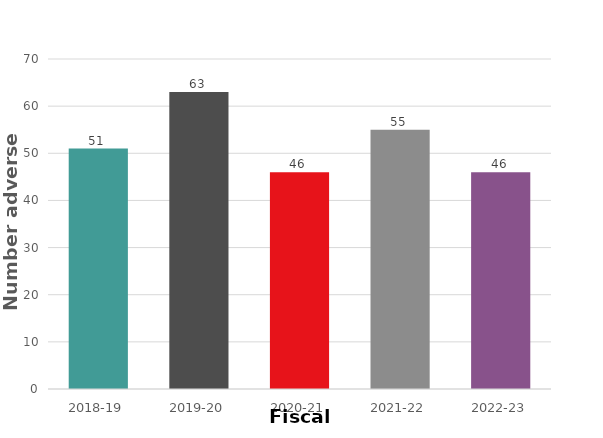
| Category | Series 0 |
|---|---|
| 2018-19 | 51 |
| 2019-20 | 63 |
| 2020-21 | 46 |
| 2021-22 | 55 |
| 2022-23 | 46 |